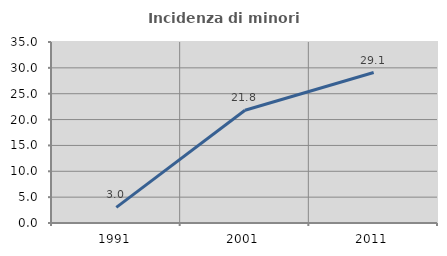
| Category | Incidenza di minori stranieri |
|---|---|
| 1991.0 | 3.03 |
| 2001.0 | 21.795 |
| 2011.0 | 29.091 |